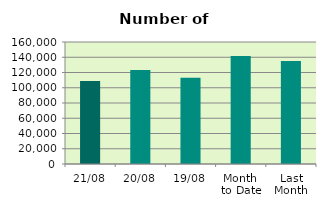
| Category | Series 0 |
|---|---|
| 21/08 | 108810 |
| 20/08 | 123362 |
| 19/08 | 113168 |
| Month 
to Date | 141782.8 |
| Last
Month | 134976 |